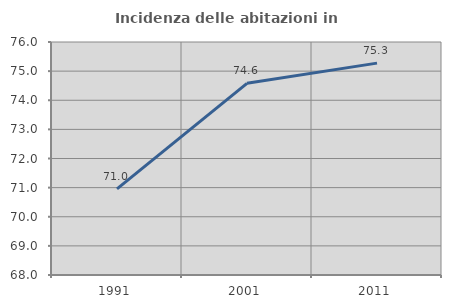
| Category | Incidenza delle abitazioni in proprietà  |
|---|---|
| 1991.0 | 70.957 |
| 2001.0 | 74.581 |
| 2011.0 | 75.275 |